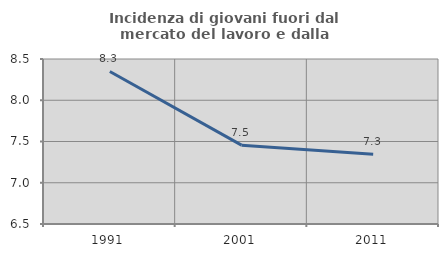
| Category | Incidenza di giovani fuori dal mercato del lavoro e dalla formazione  |
|---|---|
| 1991.0 | 8.349 |
| 2001.0 | 7.456 |
| 2011.0 | 7.346 |